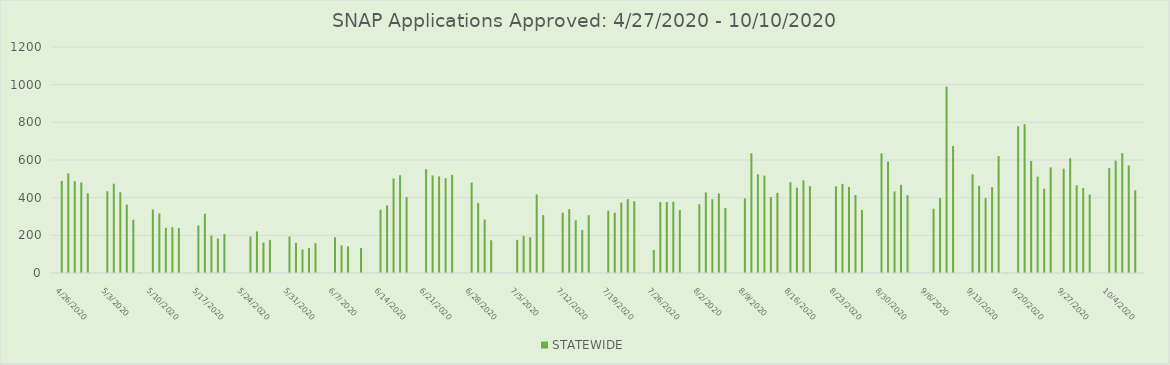
| Category | STATEWIDE |
|---|---|
| 4/27/20 | 489 |
| 4/28/20 | 529 |
| 4/29/20 | 488 |
| 4/30/20 | 481 |
| 5/1/20 | 424 |
| 5/4/20 | 434 |
| 5/5/20 | 474 |
| 5/6/20 | 429 |
| 5/7/20 | 363 |
| 5/8/20 | 283 |
| 5/9/20 | 2 |
| 5/11/20 | 337 |
| 5/12/20 | 316 |
| 5/13/20 | 240 |
| 5/14/20 | 243 |
| 5/15/20 | 239 |
| 5/16/20 | 1 |
| 5/18/20 | 252 |
| 5/19/20 | 315 |
| 5/20/20 | 199 |
| 5/21/20 | 183 |
| 5/22/20 | 207 |
| 5/26/20 | 194 |
| 5/27/20 | 221 |
| 5/28/20 | 162 |
| 5/29/20 | 176 |
| 6/1/20 | 194 |
| 6/2/20 | 160 |
| 6/3/20 | 125 |
| 6/4/20 | 133 |
| 6/5/20 | 158 |
| 6/8/20 | 190 |
| 6/9/20 | 147 |
| 6/10/20 | 142 |
| 6/12/20 | 133 |
| 6/15/20 | 336 |
| 6/16/20 | 359 |
| 6/17/20 | 502 |
| 6/18/20 | 519 |
| 6/19/20 | 403 |
| 6/22/20 | 551 |
| 6/23/20 | 518 |
| 6/24/20 | 513 |
| 6/25/20 | 503 |
| 6/26/20 | 521 |
| 6/29/20 | 480 |
| 6/30/20 | 371 |
| 7/1/20 | 284 |
| 7/2/20 | 174 |
| 7/6/20 | 176 |
| 7/7/20 | 197 |
| 7/8/20 | 190 |
| 7/9/20 | 417 |
| 7/10/20 | 307 |
| 7/13/20 | 320 |
| 7/14/20 | 339 |
| 7/15/20 | 280 |
| 7/16/20 | 229 |
| 7/17/20 | 307 |
| 7/20/20 | 331 |
| 7/21/20 | 320 |
| 7/22/20 | 374 |
| 7/23/20 | 392 |
| 7/24/20 | 381 |
| 7/27/20 | 122 |
| 7/28/20 | 376 |
| 7/29/20 | 377 |
| 7/30/20 | 378 |
| 7/31/20 | 334 |
| 8/3/20 | 365 |
| 8/4/20 | 428 |
| 8/5/20 | 392 |
| 8/6/20 | 422 |
| 8/7/20 | 345 |
| 8/10/20 | 396 |
| 8/11/20 | 636 |
| 8/12/20 | 524 |
| 8/13/20 | 517 |
| 8/14/20 | 403 |
| 8/15/20 | 426 |
| 8/17/20 | 482 |
| 8/18/20 | 453 |
| 8/19/20 | 492 |
| 8/20/20 | 461 |
| 8/24/20 | 460 |
| 8/25/20 | 473 |
| 8/26/20 | 457 |
| 8/27/20 | 414 |
| 8/28/20 | 335 |
| 8/31/20 | 635 |
| 9/1/20 | 592 |
| 9/2/20 | 433 |
| 9/3/20 | 468 |
| 9/4/20 | 413 |
| 9/8/20 | 341 |
| 9/9/20 | 398 |
| 9/10/20 | 990 |
| 9/11/20 | 674 |
| 9/14/20 | 524 |
| 9/15/20 | 463 |
| 9/16/20 | 398 |
| 9/17/20 | 456 |
| 9/18/20 | 621 |
| 9/19/20 | 2 |
| 9/21/20 | 779 |
| 9/22/20 | 790 |
| 9/23/20 | 595 |
| 9/24/20 | 512 |
| 9/25/20 | 448 |
| 9/26/20 | 561 |
| 9/28/20 | 554 |
| 9/29/20 | 609 |
| 9/30/20 | 466 |
| 10/1/20 | 451 |
| 10/2/20 | 416 |
| 10/5/20 | 557 |
| 10/6/20 | 597 |
| 10/7/20 | 637 |
| 10/8/20 | 571 |
| 10/9/20 | 439 |
| 10/10/20 | 1 |